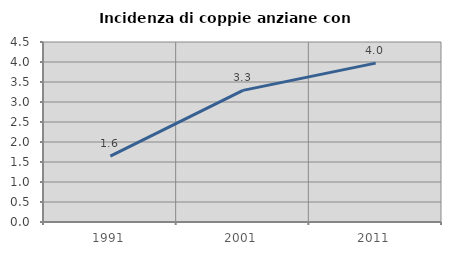
| Category | Incidenza di coppie anziane con figli |
|---|---|
| 1991.0 | 1.647 |
| 2001.0 | 3.29 |
| 2011.0 | 3.972 |